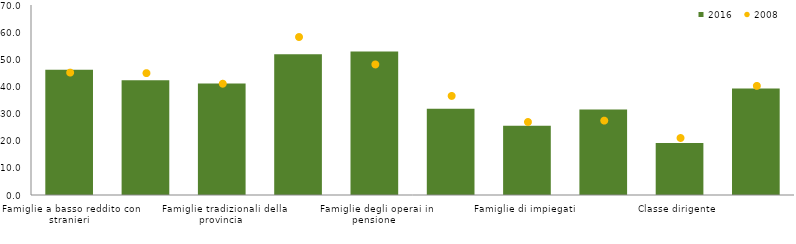
| Category | 2016 |
|---|---|
| Famiglie a basso reddito con stranieri  | 46.1 |
| Famiglie a basso reddito di soli italiani  | 42.3 |
| Famiglie tradizionali della provincia  | 41.1 |
| Anziane sole e giovani disoccupati  | 51.9 |
| Famiglie degli operai in pensione  | 52.9 |
| Giovani blue-collar  | 31.8 |
| Famiglie di impiegati  | 25.5 |
| Pensioni d’argento  | 31.5 |
| Classe dirigente  | 19.2 |
| Totale | 39.2 |